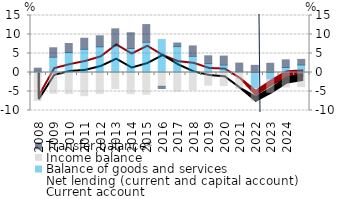
| Category | Balance of goods and services | Income balance | Transfer balance* |
|---|---|---|---|
| 2008.0 | 0.347 | -7.341 | 0.795 |
| 2009.0 | 4.021 | -5.478 | 2.483 |
| 2010.0 | 5.256 | -5.542 | 2.369 |
| 2011.0 | 6.11 | -6.105 | 2.903 |
| 2012.0 | 6.752 | -5.517 | 2.896 |
| 2013.0 | 6.971 | -4.229 | 4.521 |
| 2014.0 | 6.316 | -5.598 | 4.145 |
| 2015.0 | 7.94 | -5.691 | 4.671 |
| 2016.0 | 8.675 | -3.642 | -0.569 |
| 2017.0 | 6.819 | -4.916 | 0.941 |
| 2018.0 | 4.262 | -4.583 | 2.731 |
| 2019.0 | 2.326 | -3.326 | 2.061 |
| 2020.0 | 1.937 | -3.433 | 2.39 |
| 2021.0 | 0.304 | -4.107 | 2.177 |
| 2022.0 | -3.982 | -3.365 | 1.879 |
| 2023.0 | -1.653 | -3.568 | 2.426 |
| 2024.0 | 1.3 | -3.825 | 2.031 |
| 2025.0 | 1.985 | -3.718 | 1.461 |